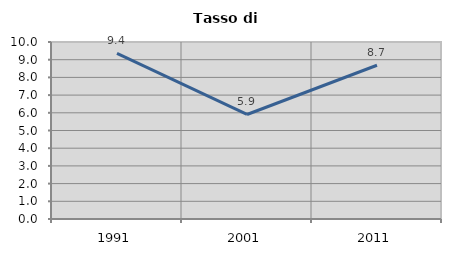
| Category | Tasso di disoccupazione   |
|---|---|
| 1991.0 | 9.356 |
| 2001.0 | 5.905 |
| 2011.0 | 8.686 |